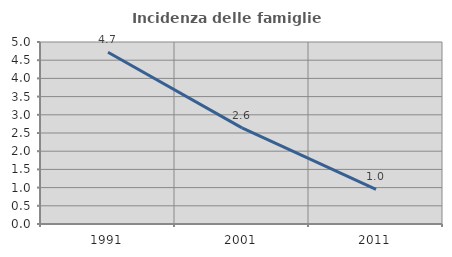
| Category | Incidenza delle famiglie numerose |
|---|---|
| 1991.0 | 4.717 |
| 2001.0 | 2.64 |
| 2011.0 | 0.951 |